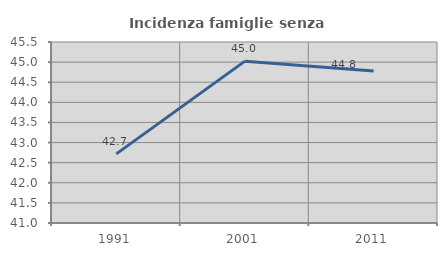
| Category | Incidenza famiglie senza nuclei |
|---|---|
| 1991.0 | 42.718 |
| 2001.0 | 45.024 |
| 2011.0 | 44.776 |